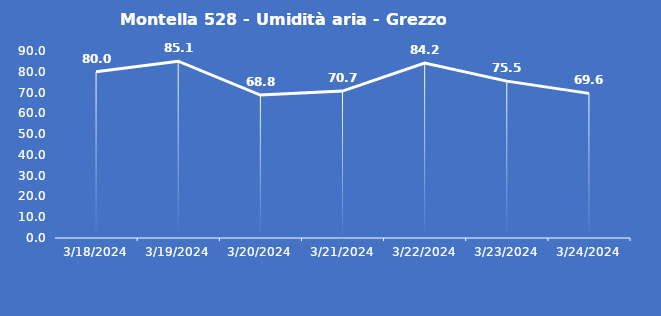
| Category | Montella 528 - Umidità aria - Grezzo (%) |
|---|---|
| 3/18/24 | 80 |
| 3/19/24 | 85.1 |
| 3/20/24 | 68.8 |
| 3/21/24 | 70.7 |
| 3/22/24 | 84.2 |
| 3/23/24 | 75.5 |
| 3/24/24 | 69.6 |